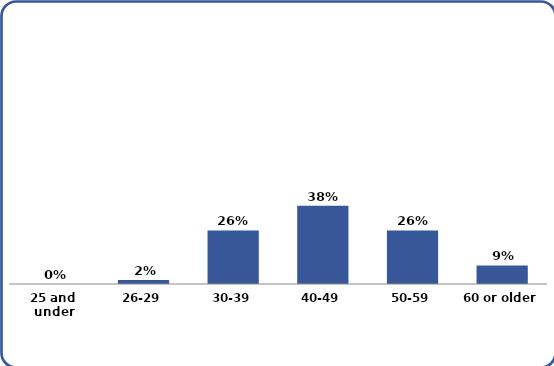
| Category | Series 0 |
|---|---|
| 25 and under | 0 |
| 26-29 | 0.02 |
| 30-39 | 0.26 |
| 40-49 | 0.38 |
| 50-59 | 0.26 |
| 60 or older | 0.09 |